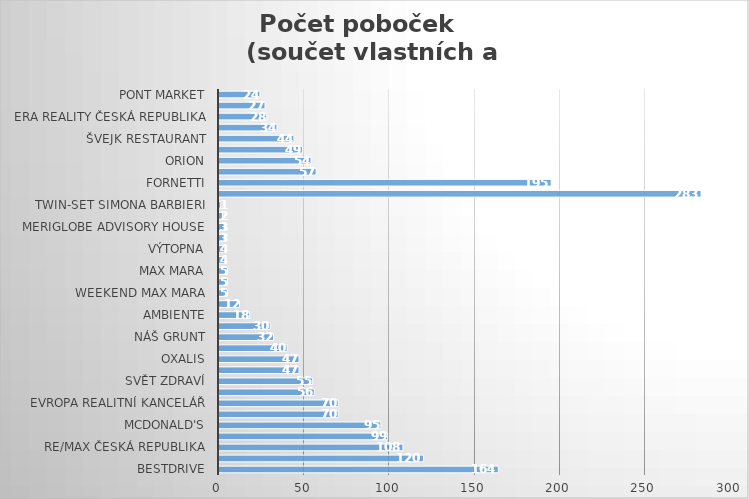
| Category | Počet poboček                                                            (součet vlastních a franchisingových) |
|---|---|
| BestDrive | 164 |
| BENU lékárna | 120 |
| RE/MAX Česká republika | 108 |
| Helen Doron English | 99 |
| McDonald's | 95 |
| NAURHOUSE | 70 |
| Evropa realitní kancelář | 70 |
| YVES ROCHER | 56 |
| Svět zdraví | 55 |
| CENTURY 21 | 47 |
| OXALIS | 47 |
| Business for Breakfast | 40 |
| Náš grunt | 32 |
| Potrefená Husa/Staropramen | 30 |
| Ambiente | 18 |
| iDry | 12 |
| Weekend Max Mara | 5 |
| MARVEL mobilní domy | 5 |
| Max Mara | 5 |
| Marina Rinaldi | 4 |
| Výtopna | 4 |
| Marella | 3 |
| MERIGLOBE ADVISORY HOUSE | 3 |
| WOOLRICH John Rich & Bros. | 2 |
| Twin-set Simona Barbieri | 1 |
| Hudební škola YAMAHA | 283 |
| Fornetti | 195 |
| Fruitisimo | 57 |
| ORION | 54 |
| UGOVA ČERSTVÁ ŠŤÁVA | 49 |
| Švejk restaurant | 44 |
| 5àsec | 34 |
| ERA Reality Česká republika | 28 |
| RÁJ SÝRŮ | 27 |
| PONT Market | 24 |